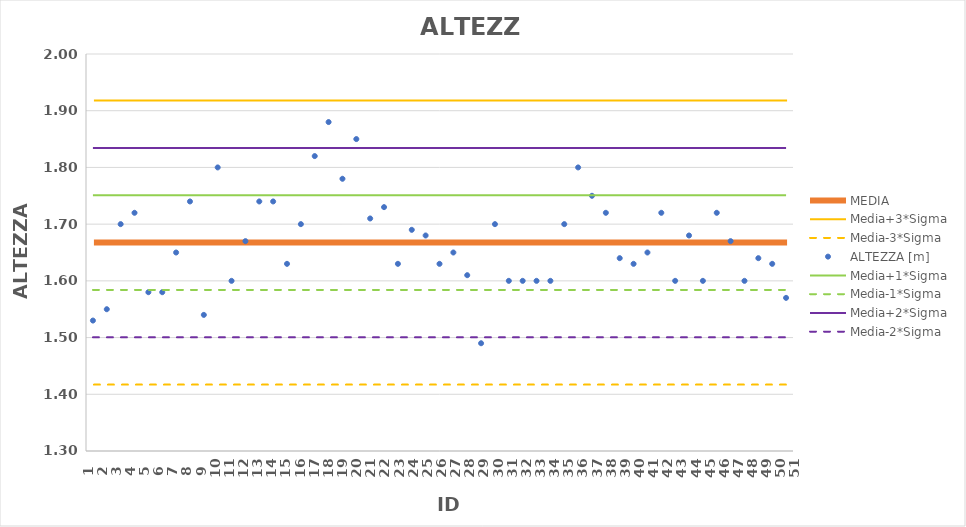
| Category | MEDIA | Media+3*Sigma | Media-3*Sigma |
|---|---|---|---|
| 1.0 | 21.069 | 28.654 | 13.483 |
| 2.0 | 21.069 | 28.654 | 13.483 |
| 3.0 | 21.069 | 28.654 | 13.483 |
| 4.0 | 21.069 | 28.654 | 13.483 |
| 5.0 | 21.069 | 28.654 | 13.483 |
| 6.0 | 21.069 | 28.654 | 13.483 |
| 7.0 | 21.069 | 28.654 | 13.483 |
| 8.0 | 21.069 | 28.654 | 13.483 |
| 9.0 | 21.069 | 28.654 | 13.483 |
| 10.0 | 21.069 | 28.654 | 13.483 |
| 11.0 | 21.069 | 28.654 | 13.483 |
| 12.0 | 21.069 | 28.654 | 13.483 |
| 13.0 | 21.069 | 28.654 | 13.483 |
| 14.0 | 21.069 | 28.654 | 13.483 |
| 15.0 | 21.069 | 28.654 | 13.483 |
| 16.0 | 21.069 | 28.654 | 13.483 |
| 17.0 | 21.069 | 28.654 | 13.483 |
| 18.0 | 21.069 | 28.654 | 13.483 |
| 19.0 | 21.069 | 28.654 | 13.483 |
| 20.0 | 21.069 | 28.654 | 13.483 |
| 21.0 | 21.069 | 28.654 | 13.483 |
| 22.0 | 21.069 | 28.654 | 13.483 |
| 23.0 | 21.069 | 28.654 | 13.483 |
| 24.0 | 21.069 | 28.654 | 13.483 |
| 25.0 | 21.069 | 28.654 | 13.483 |
| 26.0 | 21.069 | 28.654 | 13.483 |
| 27.0 | 21.069 | 28.654 | 13.483 |
| 28.0 | 21.069 | 28.654 | 13.483 |
| 29.0 | 21.069 | 28.654 | 13.483 |
| 30.0 | 21.069 | 28.654 | 13.483 |
| 31.0 | 21.069 | 28.654 | 13.483 |
| 32.0 | 21.069 | 28.654 | 13.483 |
| 33.0 | 21.069 | 28.654 | 13.483 |
| 34.0 | 21.069 | 28.654 | 13.483 |
| 35.0 | 21.069 | 28.654 | 13.483 |
| 36.0 | 21.069 | 28.654 | 13.483 |
| 37.0 | 21.069 | 28.654 | 13.483 |
| 38.0 | 21.069 | 28.654 | 13.483 |
| 39.0 | 21.069 | 28.654 | 13.483 |
| 40.0 | 21.069 | 28.654 | 13.483 |
| 41.0 | 21.069 | 28.654 | 13.483 |
| 42.0 | 21.069 | 28.654 | 13.483 |
| 43.0 | 21.069 | 28.654 | 13.483 |
| 44.0 | 21.069 | 28.654 | 13.483 |
| 45.0 | 21.069 | 28.654 | 13.483 |
| 46.0 | 21.069 | 28.654 | 13.483 |
| 47.0 | 21.069 | 28.654 | 13.483 |
| 48.0 | 21.069 | 28.654 | 13.483 |
| 49.0 | 21.069 | 28.654 | 13.483 |
| 50.0 | 21.069 | 28.654 | 13.483 |
| 51.0 | 21.069 | 28.654 | 13.483 |